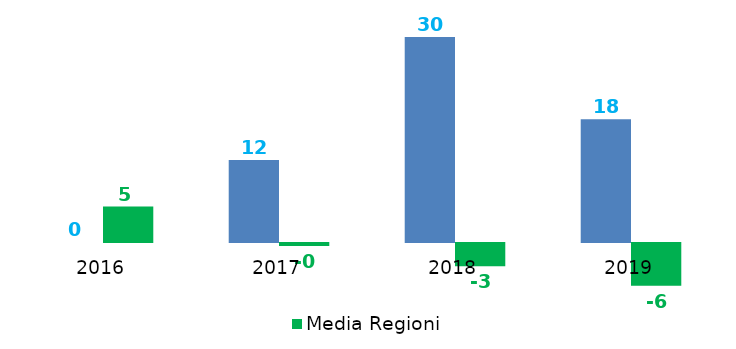
| Category | Indicatore annuale di tempestività dei pagamenti | Media Regioni |
|---|---|---|
| 2016.0 | 0 | 5.152 |
| 2017.0 | 11.93 | -0.422 |
| 2018.0 | 29.76 | -3.363 |
| 2019.0 | 17.82 | -6.184 |